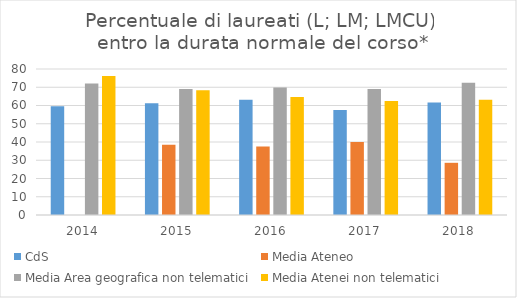
| Category | CdS | Media Ateneo | Media Area geografica non telematici | Media Atenei non telematici |
|---|---|---|---|---|
| 2014.0 | 59.6 | 0 | 72 | 76.1 |
| 2015.0 | 61.3 | 38.5 | 69.1 | 68.3 |
| 2016.0 | 63.2 | 37.5 | 69.9 | 64.7 |
| 2017.0 | 57.5 | 40 | 69.1 | 62.4 |
| 2018.0 | 61.6 | 28.6 | 72.4 | 63.1 |